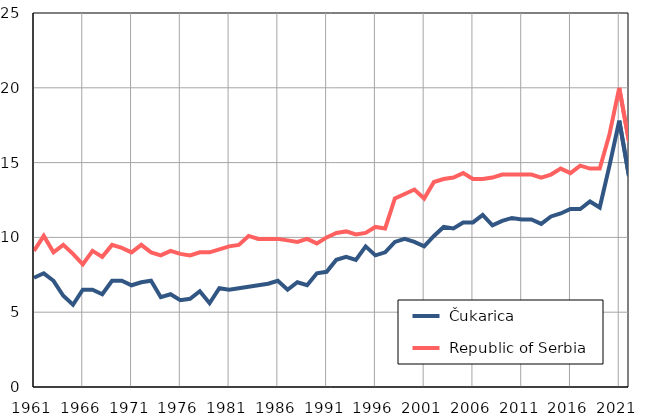
| Category |  Čukarica |  Republic of Serbia |
|---|---|---|
| 1961.0 | 7.3 | 9.1 |
| 1962.0 | 7.6 | 10.1 |
| 1963.0 | 7.1 | 9 |
| 1964.0 | 6.1 | 9.5 |
| 1965.0 | 5.5 | 8.9 |
| 1966.0 | 6.5 | 8.2 |
| 1967.0 | 6.5 | 9.1 |
| 1968.0 | 6.2 | 8.7 |
| 1969.0 | 7.1 | 9.5 |
| 1970.0 | 7.1 | 9.3 |
| 1971.0 | 6.8 | 9 |
| 1972.0 | 7 | 9.5 |
| 1973.0 | 7.1 | 9 |
| 1974.0 | 6 | 8.8 |
| 1975.0 | 6.2 | 9.1 |
| 1976.0 | 5.8 | 8.9 |
| 1977.0 | 5.9 | 8.8 |
| 1978.0 | 6.4 | 9 |
| 1979.0 | 5.6 | 9 |
| 1980.0 | 6.6 | 9.2 |
| 1981.0 | 6.5 | 9.4 |
| 1982.0 | 6.6 | 9.5 |
| 1983.0 | 6.7 | 10.1 |
| 1984.0 | 6.8 | 9.9 |
| 1985.0 | 6.9 | 9.9 |
| 1986.0 | 7.1 | 9.9 |
| 1987.0 | 6.5 | 9.8 |
| 1988.0 | 7 | 9.7 |
| 1989.0 | 6.8 | 9.9 |
| 1990.0 | 7.6 | 9.6 |
| 1991.0 | 7.7 | 10 |
| 1992.0 | 8.5 | 10.3 |
| 1993.0 | 8.7 | 10.4 |
| 1994.0 | 8.5 | 10.2 |
| 1995.0 | 9.4 | 10.3 |
| 1996.0 | 8.8 | 10.7 |
| 1997.0 | 9 | 10.6 |
| 1998.0 | 9.7 | 12.6 |
| 1999.0 | 9.9 | 12.9 |
| 2000.0 | 9.7 | 13.2 |
| 2001.0 | 9.4 | 12.6 |
| 2002.0 | 10.1 | 13.7 |
| 2003.0 | 10.7 | 13.9 |
| 2004.0 | 10.6 | 14 |
| 2005.0 | 11 | 14.3 |
| 2006.0 | 11 | 13.9 |
| 2007.0 | 11.5 | 13.9 |
| 2008.0 | 10.8 | 14 |
| 2009.0 | 11.1 | 14.2 |
| 2010.0 | 11.3 | 14.2 |
| 2011.0 | 11.2 | 14.2 |
| 2012.0 | 11.2 | 14.2 |
| 2013.0 | 10.9 | 14 |
| 2014.0 | 11.4 | 14.2 |
| 2015.0 | 11.6 | 14.6 |
| 2016.0 | 11.9 | 14.3 |
| 2017.0 | 11.9 | 14.8 |
| 2018.0 | 12.4 | 14.6 |
| 2019.0 | 12 | 14.6 |
| 2020.0 | 14.8 | 16.9 |
| 2021.0 | 17.8 | 20 |
| 2022.0 | 14.1 | 16.4 |